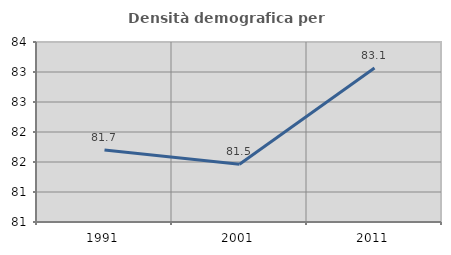
| Category | Densità demografica |
|---|---|
| 1991.0 | 81.701 |
| 2001.0 | 81.463 |
| 2011.0 | 83.067 |